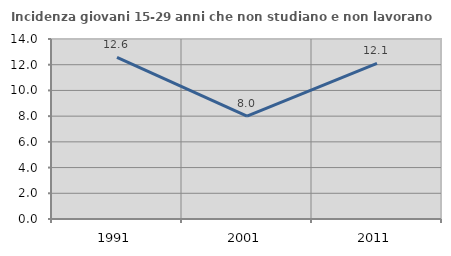
| Category | Incidenza giovani 15-29 anni che non studiano e non lavorano  |
|---|---|
| 1991.0 | 12.577 |
| 2001.0 | 7.996 |
| 2011.0 | 12.105 |